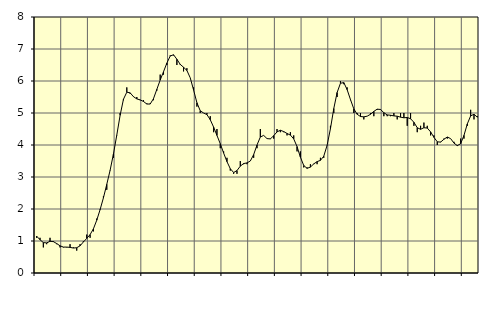
| Category | Piggar | Series 1 |
|---|---|---|
| nan | 1.1 | 1.15 |
| 87.0 | 1.1 | 1.04 |
| 87.0 | 0.8 | 0.95 |
| 87.0 | 0.9 | 0.94 |
| nan | 1.1 | 0.99 |
| 88.0 | 1 | 0.98 |
| 88.0 | 0.9 | 0.92 |
| 88.0 | 0.8 | 0.85 |
| nan | 0.8 | 0.81 |
| 89.0 | 0.8 | 0.81 |
| 89.0 | 0.9 | 0.8 |
| 89.0 | 0.8 | 0.78 |
| nan | 0.7 | 0.79 |
| 90.0 | 0.9 | 0.85 |
| 90.0 | 1 | 0.97 |
| 90.0 | 1.2 | 1.08 |
| nan | 1.1 | 1.2 |
| 91.0 | 1.3 | 1.38 |
| 91.0 | 1.7 | 1.65 |
| 91.0 | 2 | 1.98 |
| nan | 2.4 | 2.35 |
| 92.0 | 2.6 | 2.77 |
| 92.0 | 3.2 | 3.21 |
| 92.0 | 3.6 | 3.72 |
| nan | 4.3 | 4.31 |
| 93.0 | 5 | 4.93 |
| 93.0 | 5.4 | 5.43 |
| 93.0 | 5.8 | 5.65 |
| nan | 5.6 | 5.63 |
| 94.0 | 5.5 | 5.51 |
| 94.0 | 5.5 | 5.44 |
| 94.0 | 5.4 | 5.41 |
| nan | 5.4 | 5.36 |
| 95.0 | 5.3 | 5.28 |
| 95.0 | 5.3 | 5.28 |
| 95.0 | 5.4 | 5.45 |
| nan | 5.7 | 5.74 |
| 96.0 | 6.2 | 6.03 |
| 96.0 | 6.2 | 6.29 |
| 96.0 | 6.5 | 6.56 |
| nan | 6.8 | 6.78 |
| 97.0 | 6.8 | 6.82 |
| 97.0 | 6.5 | 6.68 |
| 97.0 | 6.5 | 6.52 |
| nan | 6.3 | 6.43 |
| 98.0 | 6.4 | 6.33 |
| 98.0 | 6.1 | 6.1 |
| 98.0 | 5.8 | 5.72 |
| nan | 5.2 | 5.32 |
| 99.0 | 5 | 5.07 |
| 99.0 | 5 | 5 |
| 99.0 | 5 | 4.95 |
| nan | 4.9 | 4.79 |
| 0.0 | 4.4 | 4.56 |
| 0.0 | 4.5 | 4.3 |
| 0.0 | 3.9 | 4.04 |
| nan | 3.8 | 3.75 |
| 1.0 | 3.6 | 3.48 |
| 1.0 | 3.2 | 3.26 |
| 1.0 | 3.1 | 3.14 |
| nan | 3.1 | 3.2 |
| 2.0 | 3.5 | 3.34 |
| 2.0 | 3.4 | 3.42 |
| 2.0 | 3.4 | 3.44 |
| nan | 3.5 | 3.5 |
| 3.0 | 3.6 | 3.7 |
| 3.0 | 3.9 | 4 |
| 3.0 | 4.5 | 4.25 |
| nan | 4.3 | 4.3 |
| 4.0 | 4.2 | 4.2 |
| 4.0 | 4.2 | 4.19 |
| 4.0 | 4.2 | 4.29 |
| nan | 4.5 | 4.41 |
| 5.0 | 4.4 | 4.46 |
| 5.0 | 4.4 | 4.42 |
| 5.0 | 4.3 | 4.36 |
| nan | 4.4 | 4.31 |
| 6.0 | 4.3 | 4.19 |
| 6.0 | 3.8 | 3.95 |
| 6.0 | 3.8 | 3.62 |
| nan | 3.3 | 3.36 |
| 7.0 | 3.3 | 3.27 |
| 7.0 | 3.4 | 3.31 |
| 7.0 | 3.4 | 3.41 |
| nan | 3.4 | 3.48 |
| 8.0 | 3.6 | 3.52 |
| 8.0 | 3.6 | 3.65 |
| 8.0 | 4 | 3.99 |
| nan | 4.6 | 4.51 |
| 9.0 | 5 | 5.14 |
| 9.0 | 5.5 | 5.64 |
| 9.0 | 6 | 5.93 |
| nan | 5.9 | 5.95 |
| 10.0 | 5.8 | 5.73 |
| 10.0 | 5.4 | 5.42 |
| 10.0 | 5 | 5.13 |
| nan | 5 | 4.96 |
| 11.0 | 5 | 4.89 |
| 11.0 | 4.8 | 4.88 |
| 11.0 | 4.9 | 4.9 |
| nan | 5 | 4.96 |
| 12.0 | 4.9 | 5.05 |
| 12.0 | 5.1 | 5.12 |
| 12.0 | 5.1 | 5.11 |
| nan | 4.9 | 5.01 |
| 13.0 | 4.9 | 4.94 |
| 13.0 | 4.9 | 4.93 |
| 13.0 | 5 | 4.91 |
| nan | 4.8 | 4.9 |
| 14.0 | 5 | 4.87 |
| 14.0 | 5 | 4.85 |
| 14.0 | 4.6 | 4.86 |
| nan | 5 | 4.82 |
| 15.0 | 4.6 | 4.71 |
| 15.0 | 4.4 | 4.54 |
| 15.0 | 4.6 | 4.49 |
| nan | 4.7 | 4.54 |
| 16.0 | 4.6 | 4.53 |
| 16.0 | 4.3 | 4.41 |
| 16.0 | 4.3 | 4.24 |
| nan | 4 | 4.1 |
| 17.0 | 4.1 | 4.09 |
| 17.0 | 4.2 | 4.18 |
| 17.0 | 4.2 | 4.25 |
| nan | 4.2 | 4.2 |
| 18.0 | 4.1 | 4.06 |
| 18.0 | 4 | 3.98 |
| 18.0 | 4.2 | 4.04 |
| nan | 4.2 | 4.3 |
| 19.0 | 4.6 | 4.66 |
| 19.0 | 5.1 | 4.91 |
| 19.0 | 4.8 | 4.96 |
| nan | 4.9 | 4.87 |